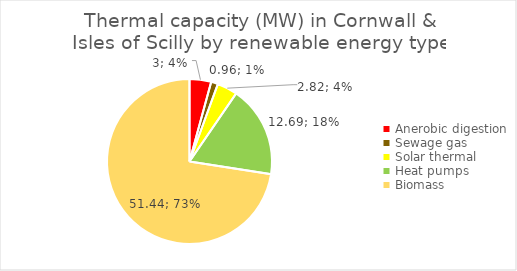
| Category | Series 0 |
|---|---|
| Anerobic digestion | 3 |
| Sewage gas | 0.96 |
| Solar thermal | 2.82 |
| Heat pumps | 12.69 |
| Biomass | 51.44 |